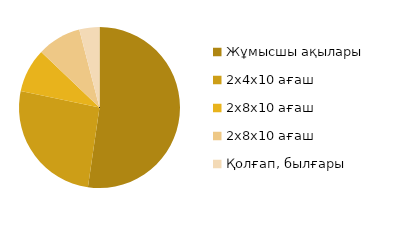
| Category | Series 0 |
|---|---|
| Жұмысшы ақылары | 200 |
| 2x4x10 ағаш | 99.4 |
| 2x8x10 ағаш | 33.75 |
| 2x8x10 ағаш | 33.75 |
| Қолғап, былғары | 15.5 |